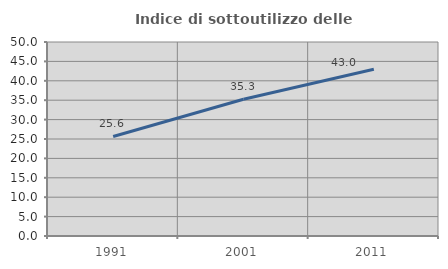
| Category | Indice di sottoutilizzo delle abitazioni  |
|---|---|
| 1991.0 | 25.648 |
| 2001.0 | 35.262 |
| 2011.0 | 42.966 |